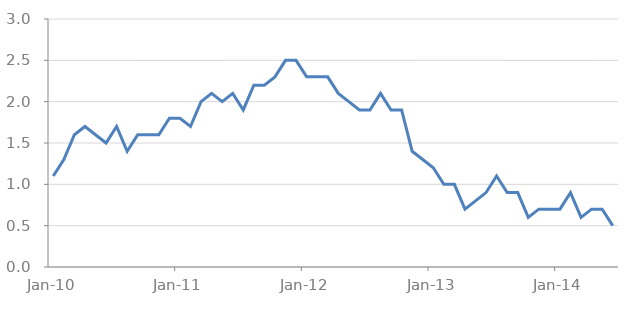
| Category | Series 0 |
|---|---|
| 2010-01-01 | 1.1 |
| 2010-02-01 | 1.3 |
| 2010-03-01 | 1.6 |
| 2010-04-01 | 1.7 |
| 2010-05-01 | 1.6 |
| 2010-06-01 | 1.5 |
| 2010-07-01 | 1.7 |
| 2010-08-01 | 1.4 |
| 2010-09-01 | 1.6 |
| 2010-10-01 | 1.6 |
| 2010-11-01 | 1.6 |
| 2010-12-01 | 1.8 |
| 2011-01-01 | 1.8 |
| 2011-02-01 | 1.7 |
| 2011-03-01 | 2 |
| 2011-04-01 | 2.1 |
| 2011-05-01 | 2 |
| 2011-06-01 | 2.1 |
| 2011-07-01 | 1.9 |
| 2011-08-01 | 2.2 |
| 2011-09-01 | 2.2 |
| 2011-10-01 | 2.3 |
| 2011-11-01 | 2.5 |
| 2011-12-01 | 2.5 |
| 2012-01-01 | 2.3 |
| 2012-02-01 | 2.3 |
| 2012-03-01 | 2.3 |
| 2012-04-01 | 2.1 |
| 2012-05-01 | 2 |
| 2012-06-01 | 1.9 |
| 2012-07-01 | 1.9 |
| 2012-08-01 | 2.1 |
| 2012-09-01 | 1.9 |
| 2012-10-01 | 1.9 |
| 2012-11-01 | 1.4 |
| 2012-12-01 | 1.3 |
| 2013-01-01 | 1.2 |
| 2013-02-01 | 1 |
| 2013-03-01 | 1 |
| 2013-04-01 | 0.7 |
| 2013-05-01 | 0.8 |
| 2013-06-01 | 0.9 |
| 2013-07-01 | 1.1 |
| 2013-08-01 | 0.9 |
| 2013-09-01 | 0.9 |
| 2013-10-01 | 0.6 |
| 2013-11-01 | 0.7 |
| 2013-12-01 | 0.7 |
| 2014-01-01 | 0.7 |
| 2014-02-01 | 0.9 |
| 2014-03-01 | 0.6 |
| 2014-04-01 | 0.7 |
| 2014-05-01 | 0.7 |
| 2014-06-01 | 0.5 |